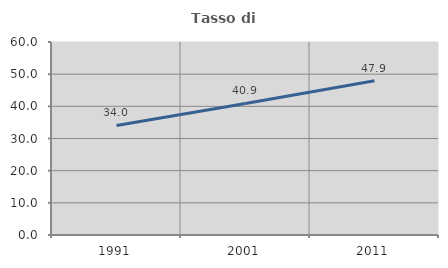
| Category | Tasso di occupazione   |
|---|---|
| 1991.0 | 34.043 |
| 2001.0 | 40.884 |
| 2011.0 | 47.933 |